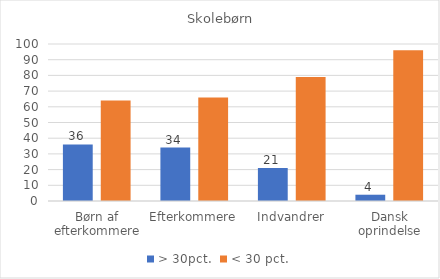
| Category | > 30pct. | < 30 pct. |
|---|---|---|
| Børn af efterkommere | 36 | 64 |
| Efterkommere | 34 | 66 |
| Indvandrer | 21 | 79 |
| Dansk oprindelse | 4 | 96 |